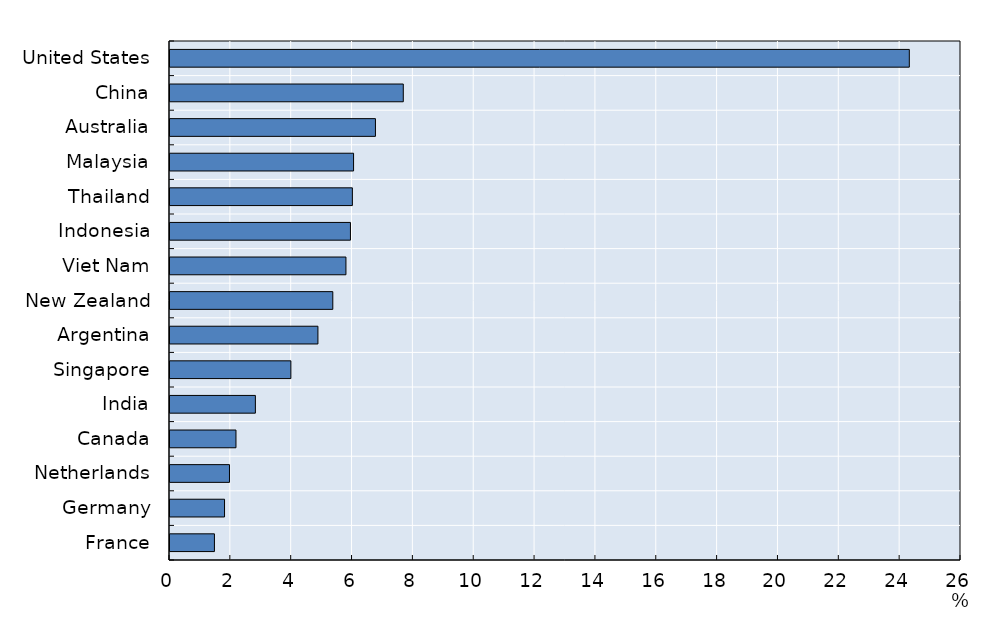
| Category | Series 0 |
|---|---|
| France | 1.461 |
| Germany | 1.793 |
| Netherlands | 1.955 |
| Canada | 2.169 |
| India | 2.807 |
| Singapore | 3.973 |
| Argentina | 4.862 |
| New Zealand | 5.352 |
| Viet Nam | 5.783 |
| Indonesia | 5.931 |
| Thailand | 5.995 |
| Malaysia | 6.034 |
| Australia | 6.753 |
| China | 7.668 |
| United States | 24.301 |